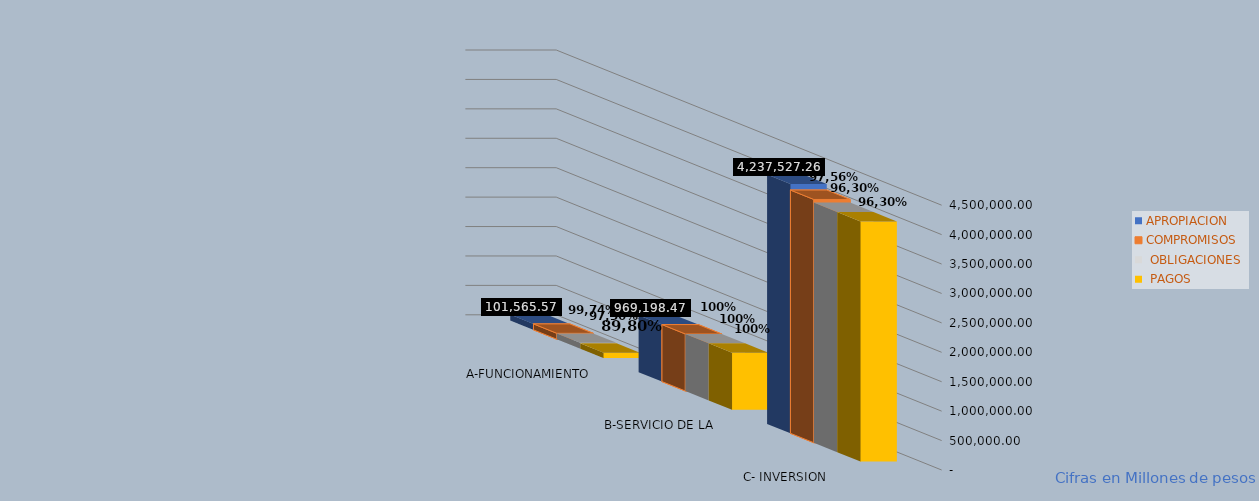
| Category | APROPIACION | COMPROMISOS |  OBLIGACIONES |  PAGOS |
|---|---|---|---|---|
| A-FUNCIONAMIENTO | 101565.565 | 101301.581 | 99051.932 | 91158.147 |
| B-SERVICIO DE LA DEUDA PÚBLICA | 969198.471 | 969198.471 | 969198.471 | 969198.471 |
| C- INVERSION | 4237527.256 | 4134043.007 | 4080845.741 | 4080663.312 |